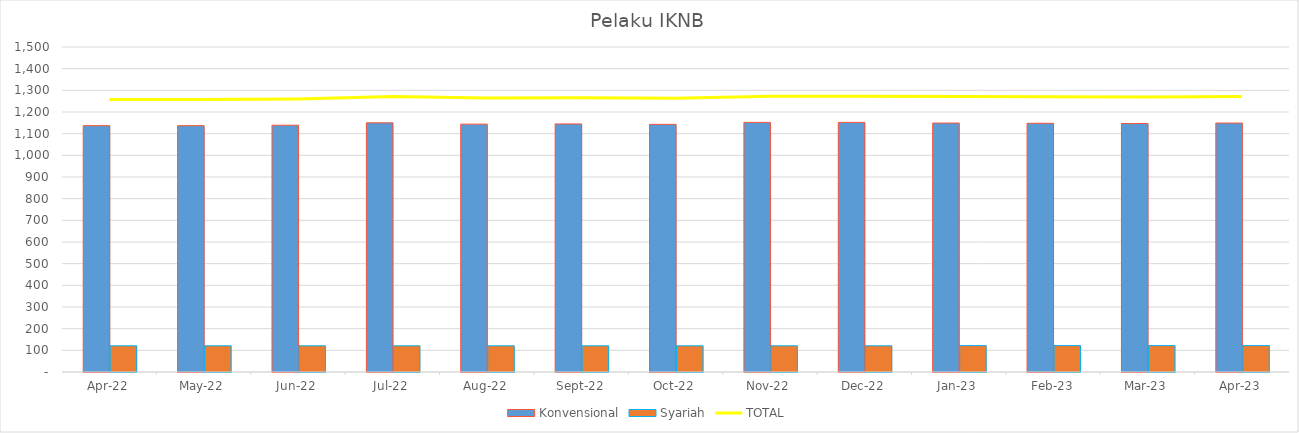
| Category |  Konvensional  |  Syariah  |
|---|---|---|
| 2022-04-01 | 1137 | 121 |
| 2022-05-01 | 1137 | 121 |
| 2022-06-01 | 1139 | 121 |
| 2022-07-01 | 1150 | 121 |
| 2022-08-01 | 1144 | 121 |
| 2022-09-01 | 1145 | 121 |
| 2022-10-01 | 1143 | 121 |
| 2022-11-01 | 1152 | 121 |
| 2022-12-01 | 1152 | 121 |
| 2023-01-01 | 1149 | 122 |
| 2023-02-01 | 1148 | 122 |
| 2023-03-01 | 1147 | 122 |
| 2023-04-01 | 1149 | 122 |